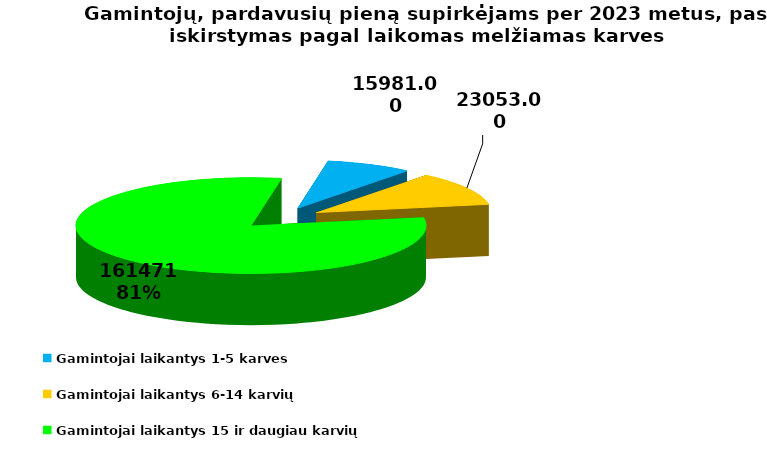
| Category | Gamintojų sk. |
|---|---|
| Gamintojai laikantys 1-5 karves | 15981 |
| Gamintojai laikantys 6-14 karvių | 23053 |
| Gamintojai laikantys 15 ir daugiau karvių | 161471 |